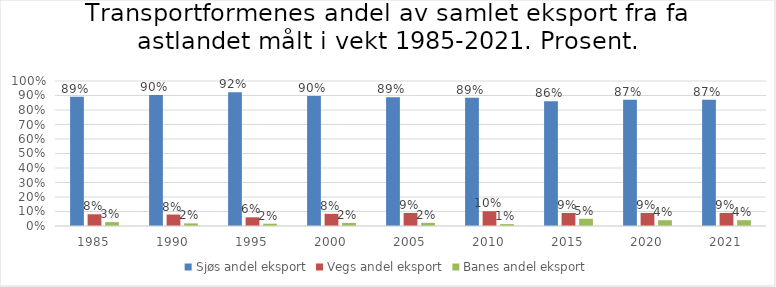
| Category | Sjøs andel eksport | Vegs andel eksport | Banes andel eksport |
|---|---|---|---|
| 1985.0 | 0.891 | 0.081 | 0.027 |
| 1990.0 | 0.903 | 0.079 | 0.018 |
| 1995.0 | 0.923 | 0.06 | 0.016 |
| 2000.0 | 0.896 | 0.084 | 0.021 |
| 2005.0 | 0.888 | 0.09 | 0.022 |
| 2010.0 | 0.885 | 0.102 | 0.013 |
| 2015.0 | 0.86 | 0.09 | 0.05 |
| 2020.0 | 0.87 | 0.09 | 0.04 |
| 2021.0 | 0.87 | 0.09 | 0.04 |